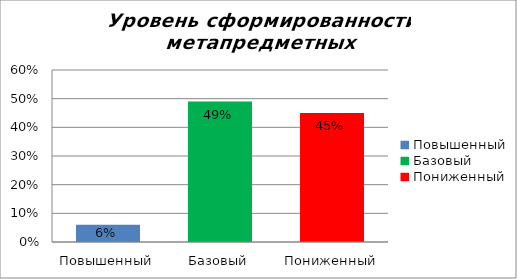
| Category | Уровень сформированности метапредметных результатов |
|---|---|
| Повышенный | 0.06 |
| Базовый | 0.49 |
| Пониженный | 0.45 |